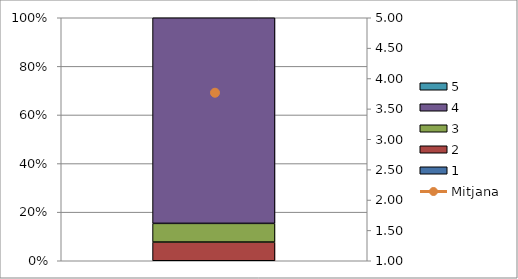
| Category | 1 | 2 | 3 | 4 | 5 |
|---|---|---|---|---|---|
| 0 | 0 | 1 | 1 | 11 | 0 |